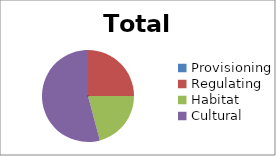
| Category | Total | Citizens |
|---|---|---|
| Provisioning | 23 | 12 |
| Regulating | 40 | 19 |
| Habitat | 31 | 17 |
| Cultural | 52 | 42 |